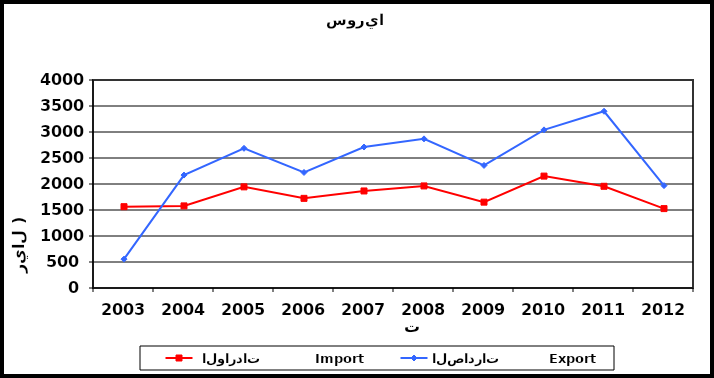
| Category |  الواردات           Import | الصادرات          Export |
|---|---|---|
| 2003.0 | 1564 | 555 |
| 2004.0 | 1579 | 2172 |
| 2005.0 | 1945 | 2686 |
| 2006.0 | 1724 | 2222 |
| 2007.0 | 1866 | 2711 |
| 2008.0 | 1963 | 2868 |
| 2009.0 | 1651 | 2357 |
| 2010.0 | 2152 | 3041 |
| 2011.0 | 1956 | 3399 |
| 2012.0 | 1527 | 1969 |